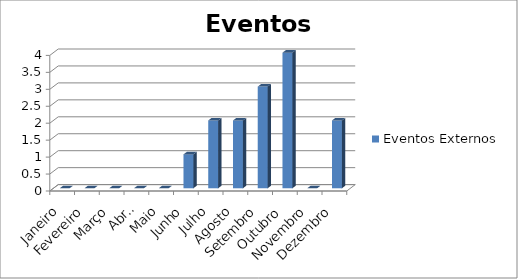
| Category | Eventos Externos |
|---|---|
| Janeiro | 0 |
| Fevereiro | 0 |
| Março | 0 |
| Abril | 0 |
| Maio | 0 |
| Junho | 1 |
| Julho | 2 |
| Agosto | 2 |
| Setembro | 3 |
| Outubro | 4 |
| Novembro | 0 |
| Dezembro | 2 |